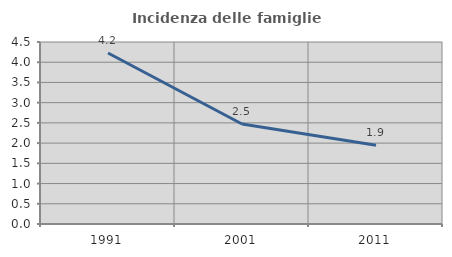
| Category | Incidenza delle famiglie numerose |
|---|---|
| 1991.0 | 4.229 |
| 2001.0 | 2.473 |
| 2011.0 | 1.948 |